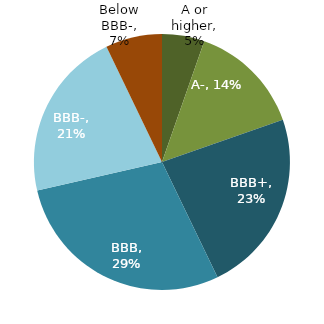
| Category | Series 0 |
|---|---|
| A or higher | 0.054 |
| A- | 0.143 |
| BBB+ | 0.232 |
| BBB | 0.286 |
| BBB- | 0.214 |
| Below BBB- | 0.071 |